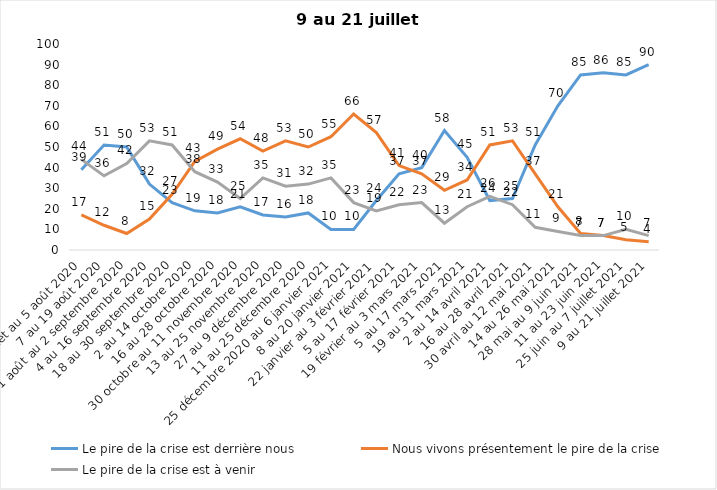
| Category | Le pire de la crise est derrière nous | Nous vivons présentement le pire de la crise | Le pire de la crise est à venir |
|---|---|---|---|
| 24 juillet au 5 août 2020 | 39 | 17 | 44 |
| 7 au 19 août 2020 | 51 | 12 | 36 |
| 21 août au 2 septembre 2020 | 50 | 8 | 42 |
| 4 au 16 septembre 2020 | 32 | 15 | 53 |
| 18 au 30 septembre 2020 | 23 | 27 | 51 |
| 2 au 14 octobre 2020 | 19 | 43 | 38 |
| 16 au 28 octobre 2020 | 18 | 49 | 33 |
| 30 octobre au 11 novembre 2020 | 21 | 54 | 25 |
| 13 au 25 novembre 2020 | 17 | 48 | 35 |
| 27 au 9 décembre 2020 | 16 | 53 | 31 |
| 11 au 25 décembre 2020 | 18 | 50 | 32 |
| 25 décembre 2020 au 6 janvier 2021 | 10 | 55 | 35 |
| 8 au 20 janvier 2021 | 10 | 66 | 23 |
| 22 janvier au 3 février 2021 | 24 | 57 | 19 |
| 5 au 17 février 2021 | 37 | 41 | 22 |
| 19 février au 3 mars 2021 | 40 | 37 | 23 |
| 5 au 17 mars 2021 | 58 | 29 | 13 |
| 19 au 31 mars 2021 | 45 | 34 | 21 |
| 2 au 14 avril 2021 | 24 | 51 | 26 |
| 16 au 28 avril 2021 | 25 | 53 | 22 |
| 30 avril au 12 mai 2021 | 51 | 37 | 11 |
| 14 au 26 mai 2021 | 70 | 21 | 9 |
| 28 mai au 9 juin 2021 | 85 | 8 | 7 |
| 11 au 23 juin 2021 | 86 | 7 | 7 |
| 25 juin au 7 juillet 2021 | 85 | 5 | 10 |
| 9 au 21 juillet 2021 | 90 | 4 | 7 |